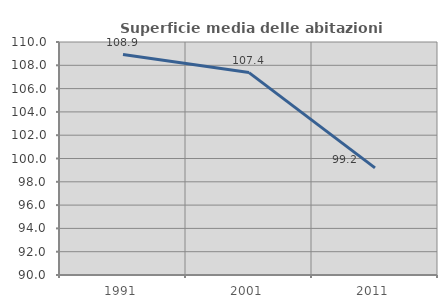
| Category | Superficie media delle abitazioni occupate |
|---|---|
| 1991.0 | 108.923 |
| 2001.0 | 107.375 |
| 2011.0 | 99.195 |